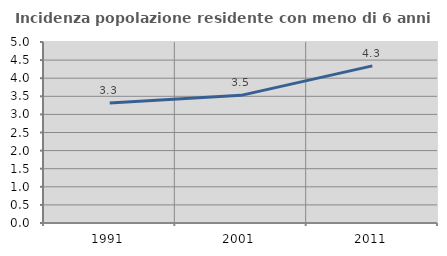
| Category | Incidenza popolazione residente con meno di 6 anni |
|---|---|
| 1991.0 | 3.317 |
| 2001.0 | 3.526 |
| 2011.0 | 4.34 |